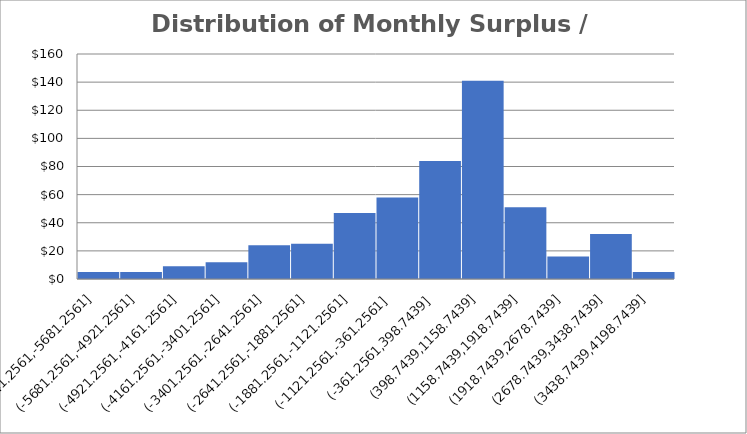
| Category | Sim 1 | Sim 2 | Sim 3 | Sim 4 | Sim 5 | Sim 6 |
|---|---|---|---|---|---|---|
| Month 1 | 323.217 | -1188.277 | 1329.893 | 1302.426 | -977.46 | -2030.516 |
| Month 2 | 1511.64 | -3619.711 | -878.11 | 4817.74 | -2707.925 | -3848.313 |
| Month 3 | -2219.814 | -4678.217 | -328.678 | 5685.677 | -3373.505 | -2619.034 |
| Month 4 | -963.664 | -8020.726 | -842.601 | 3971.387 | -6344.552 | -1442.855 |
| Month 5 | 2399.249 | -7407.256 | 1607.309 | 4490.006 | -6359.848 | 1328.719 |
| Month 6 | 986.986 | -6742.185 | 2513.443 | 1102.319 | -9092.288 | 1232.145 |
| Month 7 | 1980.853 | -7080.968 | 2852.51 | 2081.905 | -8138.822 | 2401.83 |
| Month 8 | 2699.2 | -6681.528 | 3100.232 | 2167.93 | -9312.318 | 3008.696 |
| Month 9 | 3303.937 | -8182.409 | 6504.104 | 2406.828 | -9075.146 | 2840.651 |
| Month 10 | 6399.653 | -10212.858 | 4904.532 | 3068.161 | -9003.884 | -1937.614 |
| Month 11 | 5337.071 | -9935.709 | 6283.287 | 2267.347 | -6810.177 | -593.254 |
| Month 12 | 6592.934 | -11305.769 | 2522.81 | 2901.504 | -5492.812 | -542.084 |